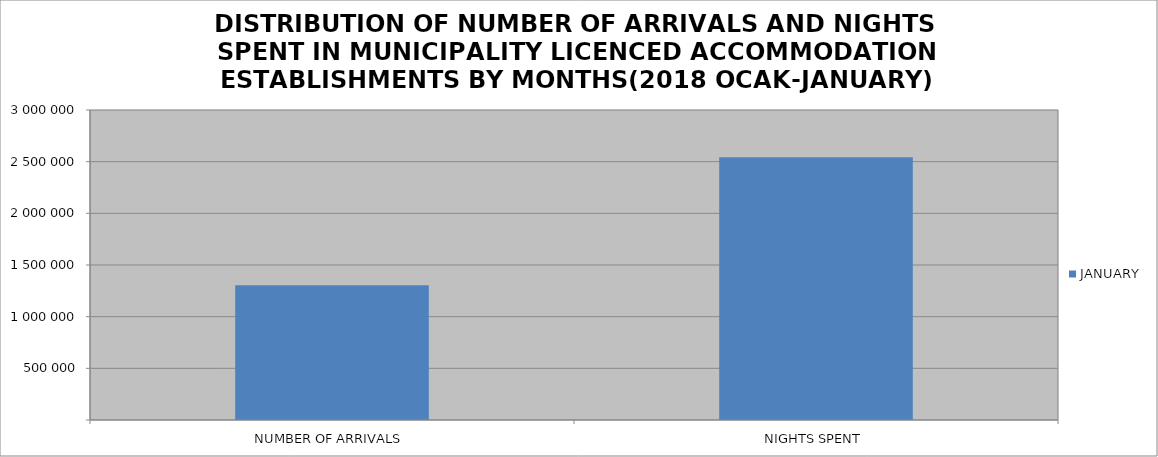
| Category | JANUARY |
|---|---|
| NUMBER OF ARRIVALS | 1303353 |
| NIGHTS SPENT | 2542103 |